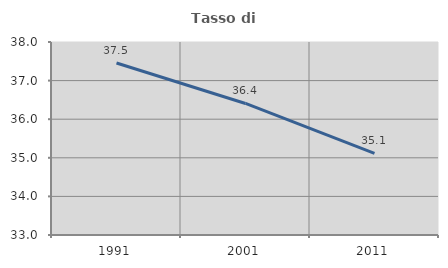
| Category | Tasso di occupazione   |
|---|---|
| 1991.0 | 37.456 |
| 2001.0 | 36.408 |
| 2011.0 | 35.117 |